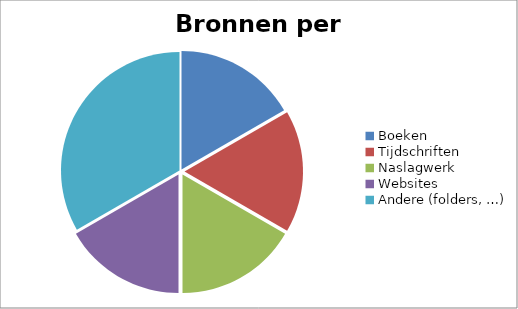
| Category | Series 0 | Series 1 |
|---|---|---|
| Boeken | 5 | 0.2 |
| Tijdschriften | 5 | 0.2 |
| Naslagwerk | 5 | 0.2 |
| Websites | 5 | 0.2 |
| Andere (folders, …) | 10 | 0.1 |